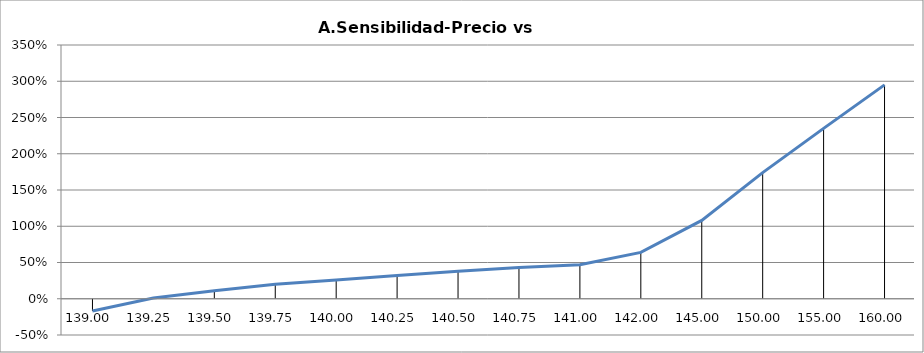
| Category | Series 0 |
|---|---|
| 139.0 | -0.17 |
| 139.25 | 0.01 |
| 139.5 | 0.11 |
| 139.75 | 0.2 |
| 140.0 | 0.26 |
| 140.25 | 0.32 |
| 140.5 | 0.38 |
| 140.75 | 0.43 |
| 141.0 | 0.47 |
| 142.0 | 0.64 |
| 145.0 | 1.08 |
| 150.0 | 1.74 |
| 155.0 | 2.35 |
| 160.0 | 2.95 |